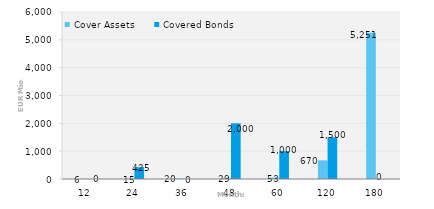
| Category | Cover Assets | Covered Bonds |
|---|---|---|
| 12.0 | 6.001 | 0 |
| 24.0 | 15.168 | 425 |
| 36.0 | 19.691 | 0 |
| 48.0 | 28.612 | 2000 |
| 60.0 | 52.695 | 1000 |
| 120.0 | 670.07 | 1500 |
| 180.0 | 5251.184 | 0 |